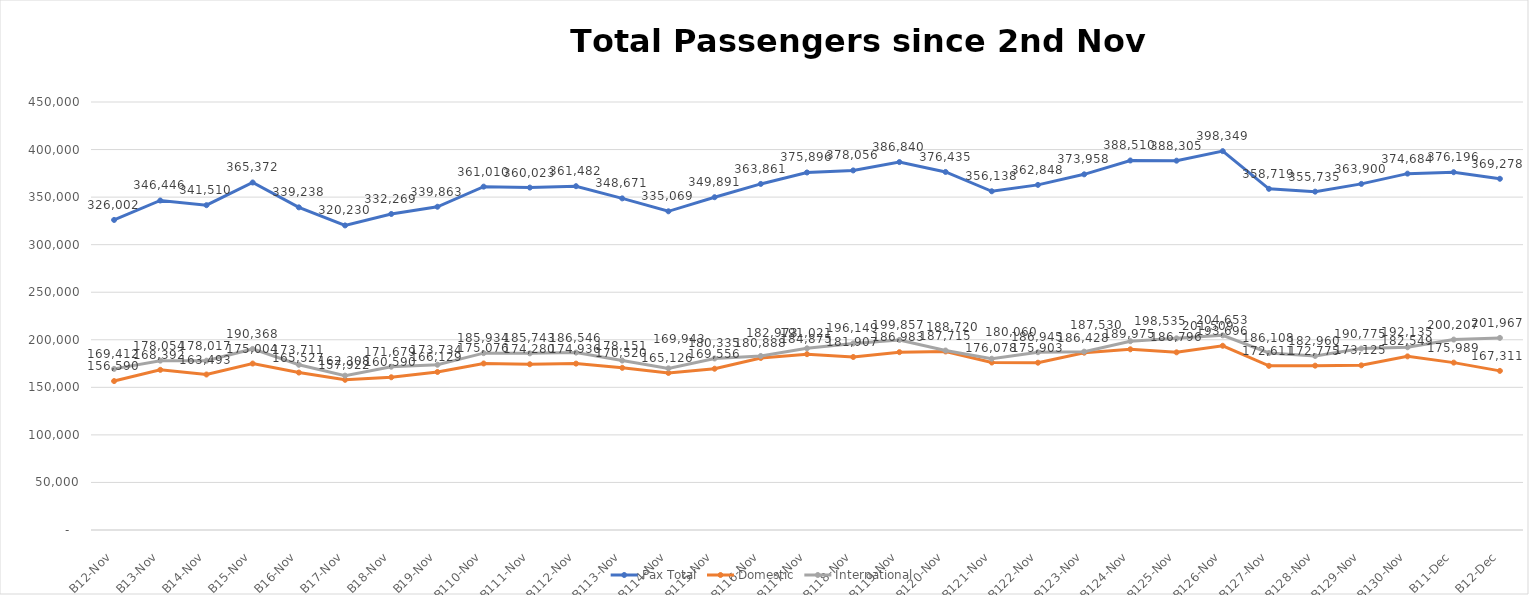
| Category | Pax Total | Domestic | International |
|---|---|---|---|
| 2023-11-02 | 326002 | 156590 | 169412 |
| 2023-11-03 | 346446 | 168392 | 178054 |
| 2023-11-04 | 341510 | 163493 | 178017 |
| 2023-11-05 | 365372 | 175004 | 190368 |
| 2023-11-06 | 339238 | 165527 | 173711 |
| 2023-11-07 | 320230 | 157922 | 162308 |
| 2023-11-08 | 332269 | 160590 | 171679 |
| 2023-11-09 | 339863 | 166129 | 173734 |
| 2023-11-10 | 361010 | 175076 | 185934 |
| 2023-11-11 | 360023 | 174280 | 185743 |
| 2023-11-12 | 361482 | 174936 | 186546 |
| 2023-11-13 | 348671 | 170520 | 178151 |
| 2023-11-14 | 335069 | 165126 | 169943 |
| 2023-11-15 | 349891 | 169556 | 180335 |
| 2023-11-16 | 363861 | 180888 | 182973 |
| 2023-11-17 | 375896 | 184875 | 191021 |
| 2023-11-18 | 378056 | 181907 | 196149 |
| 2023-11-19 | 386840 | 186983 | 199857 |
| 2023-11-20 | 376435 | 187715 | 188720 |
| 2023-11-21 | 356138 | 176078 | 180060 |
| 2023-11-22 | 362848 | 175903 | 186945 |
| 2023-11-23 | 373958 | 186428 | 187530 |
| 2023-11-24 | 388510 | 189975 | 198535 |
| 2023-11-25 | 388305 | 186796 | 201509 |
| 2023-11-26 | 398349 | 193696 | 204653 |
| 2023-11-27 | 358719 | 172611 | 186108 |
| 2023-11-28 | 355735 | 172775 | 182960 |
| 2023-11-29 | 363900 | 173125 | 190775 |
| 2023-11-30 | 374684 | 182549 | 192135 |
| 2023-12-01 | 376196 | 175989 | 200207 |
| 2023-12-02 | 369278 | 167311 | 201967 |